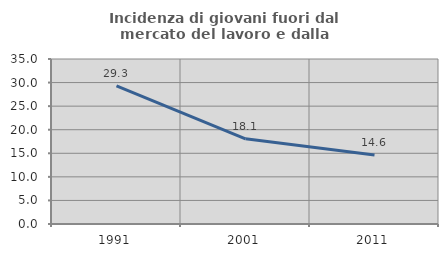
| Category | Incidenza di giovani fuori dal mercato del lavoro e dalla formazione  |
|---|---|
| 1991.0 | 29.295 |
| 2001.0 | 18.072 |
| 2011.0 | 14.634 |